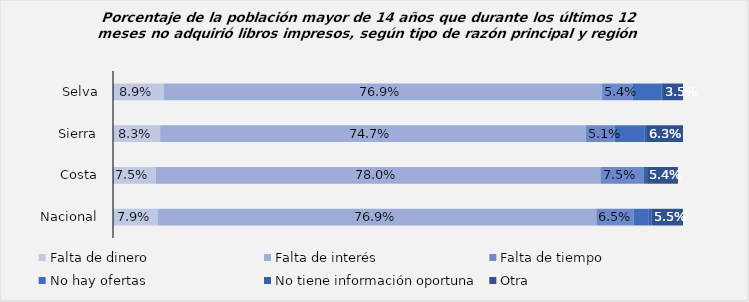
| Category | Falta de dinero | Falta de interés | Falta de tiempo | No hay ofertas | No tiene información oportuna | Otra |
|---|---|---|---|---|---|---|
| Selva | 0.089 | 0.769 | 0.054 | 0.05 | 0.003 | 0.035 |
| Sierra | 0.083 | 0.746 | 0.051 | 0.052 | 0.005 | 0.063 |
| Costa | 0.075 | 0.78 | 0.075 | 0.001 | 0.006 | 0.054 |
| Nacional | 0.079 | 0.769 | 0.065 | 0.027 | 0.005 | 0.055 |